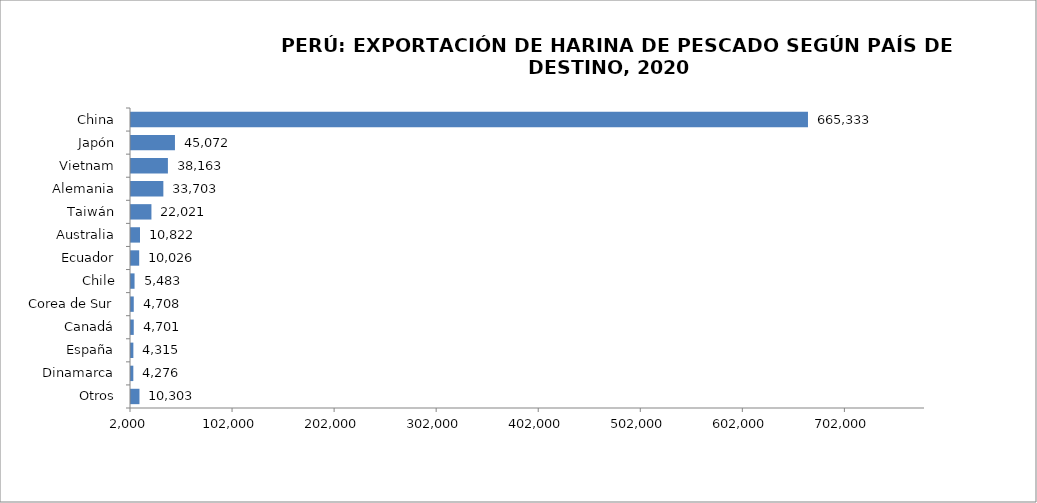
| Category | Series 0 |
|---|---|
| Otros | 10303.104 |
| Dinamarca | 4275.645 |
| España | 4314.815 |
| Canadá | 4700.635 |
| Corea de Sur | 4707.935 |
| Chile | 5483.07 |
| Ecuador | 10026.196 |
| Australia | 10822.45 |
| Taiwán | 22021.2 |
| Alemania | 33702.8 |
| Vietnam | 38162.767 |
| Japón | 45071.896 |
| China | 665332.774 |